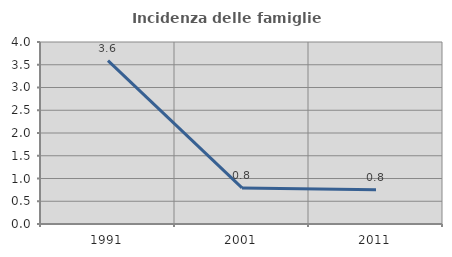
| Category | Incidenza delle famiglie numerose |
|---|---|
| 1991.0 | 3.592 |
| 2001.0 | 0.792 |
| 2011.0 | 0.752 |